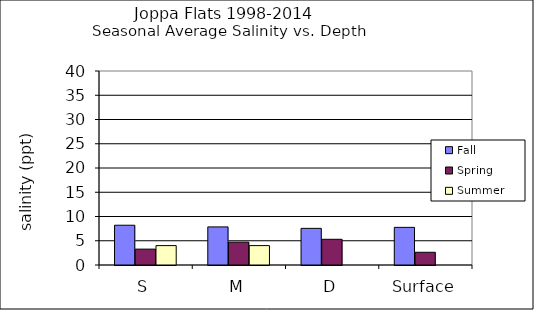
| Category | Fall | Spring | Summer |
|---|---|---|---|
| S | 8.202 | 3.276 | 4 |
| M | 7.852 | 4.709 | 4 |
| D | 7.552 | 5.301 | 0 |
| Surface | 7.76 | 2.625 | 0 |